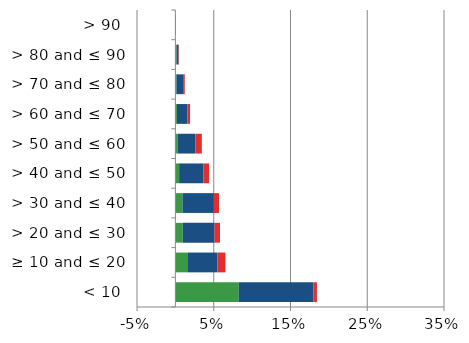
| Category | England | Scotland | Wales |
|---|---|---|---|
| < 10 | 0.083 | 0.097 | 0.005 |
| ≥ 10 and ≤ 20 | 0.016 | 0.038 | 0.01 |
| > 20 and ≤ 30 | 0.01 | 0.041 | 0.007 |
| > 30 and ≤ 40 | 0.009 | 0.041 | 0.007 |
| > 40 and ≤ 50 | 0.005 | 0.032 | 0.007 |
| > 50 and ≤ 60 | 0.003 | 0.023 | 0.008 |
| > 60 and ≤ 70 | 0.002 | 0.014 | 0.003 |
| > 70 and ≤ 80 | 0.001 | 0.009 | 0.002 |
| > 80 and ≤ 90 | 0.002 | 0.003 | 0.001 |
| > 90 | 0 | 0.001 | 0 |